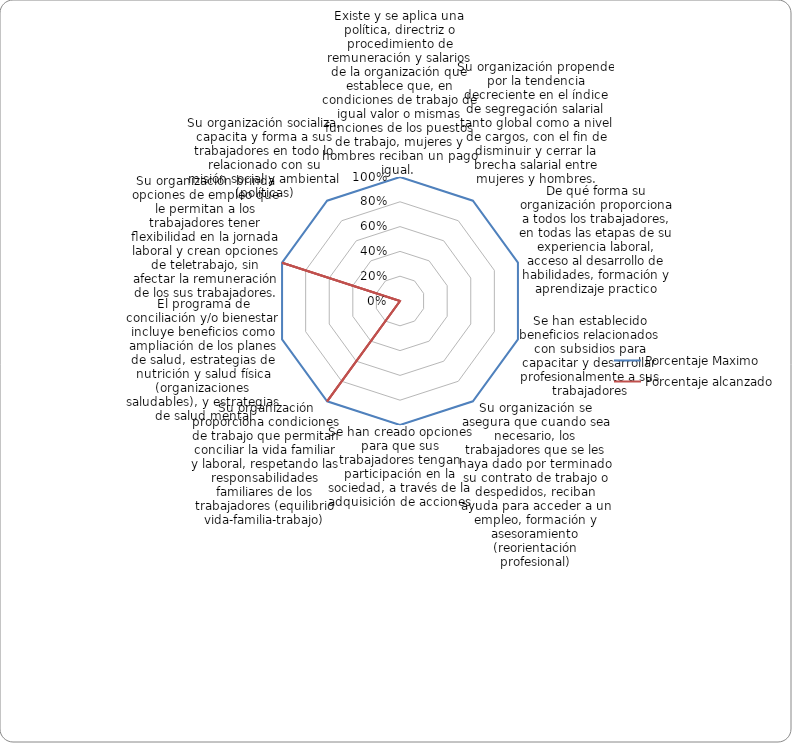
| Category | Porcentaje Maximo | Porcentaje alcanzado |
|---|---|---|
| Existe y se aplica una política, directriz o procedimiento de remuneración y salarios de la organización que establece que, en condiciones de trabajo de igual valor o mismas funciones de los puestos de trabajo, mujeres y hombres reciban un pago igual.  | 1 | 0 |
| Su organización propende por la tendencia decreciente en el índice de segregación salarial tanto global como a nivel de cargos, con el fin de disminuir y cerrar la brecha salarial entre mujeres y hombres. | 1 | 0 |
| De qué forma su organización proporciona a todos los trabajadores, en todas las etapas de su experiencia laboral, acceso al desarrollo de habilidades, formación y aprendizaje practico | 1 | 0 |
| Se han establecido beneficios relacionados con subsidios para capacitar y desarrollar profesionalmente a sus trabajadores | 1 | 0 |
| Su organización se asegura que cuando sea necesario, los trabajadores que se les haya dado por terminado su contrato de trabajo o despedidos, reciban ayuda para acceder a un empleo, formación y asesoramiento (reorientación profesional) | 1 | 0 |
| Se han creado opciones para que sus trabajadores tengan participación en la sociedad, a través de la adquisición de acciones | 1 | 0 |
| Su organización proporciona condiciones de trabajo que permitan conciliar la vida familiar y laboral, respetando las responsabilidades familiares de los trabajadores (equilibrio vida-familia-trabajo) | 1 | 1 |
| El programa de conciliación y/o bienestar incluye beneficios como ampliación de los planes de salud, estrategias de nutrición y salud física (organizaciones saludables), y estrategias de salud mental | 1 | 0 |
| Su organización brinda opciones de empleo que le permitan a los trabajadores tener ﬂexibilidad en la jornada laboral y crean opciones de teletrabajo, sin afectar la remuneración de los sus trabajadores. | 1 | 1 |
| Su organización socializa, capacita y forma a sus trabajadores en todo lo relacionado con su misión social y ambiental (políticas) | 1 | 0 |